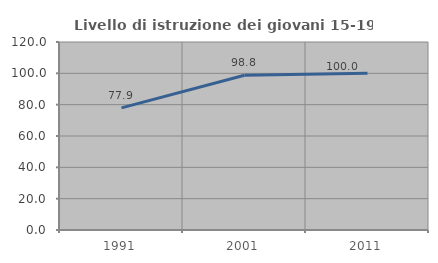
| Category | Livello di istruzione dei giovani 15-19 anni |
|---|---|
| 1991.0 | 77.934 |
| 2001.0 | 98.765 |
| 2011.0 | 100 |